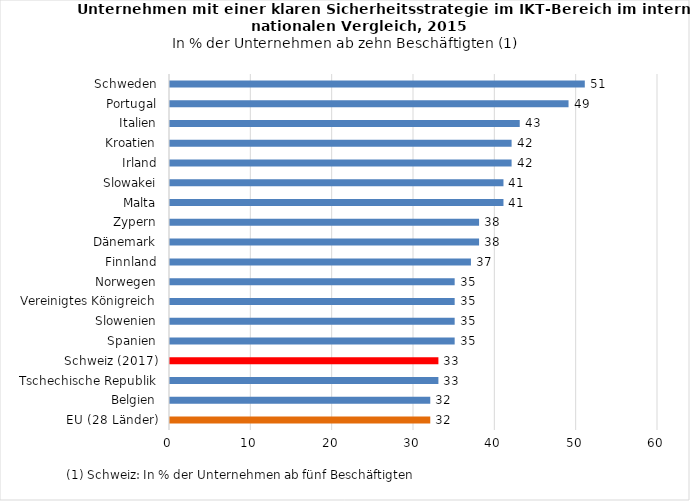
| Category | Series 0 |
|---|---|
| EU (28 Länder) | 32 |
| Belgien | 32 |
| Tschechische Republik | 33 |
| Schweiz (2017) | 33 |
| Spanien | 35 |
| Slowenien | 35 |
| Vereinigtes Königreich | 35 |
| Norwegen | 35 |
| Finnland | 37 |
| Dänemark | 38 |
| Zypern | 38 |
| Malta | 41 |
| Slowakei | 41 |
| Irland | 42 |
| Kroatien | 42 |
| Italien | 43 |
| Portugal | 49 |
| Schweden | 51 |